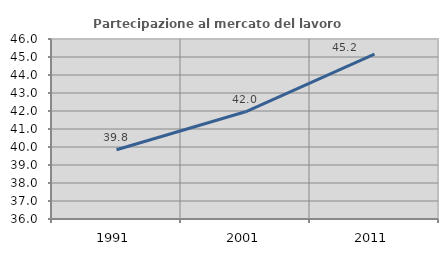
| Category | Partecipazione al mercato del lavoro  femminile |
|---|---|
| 1991.0 | 39.848 |
| 2001.0 | 41.957 |
| 2011.0 | 45.159 |